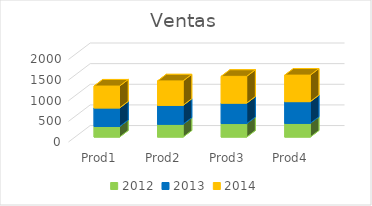
| Category | 2012 | 2013 | 2014 |
|---|---|---|---|
| Prod1 | 256 | 450 | 530 |
| Prod2 | 312 | 458 | 591 |
| Prod3 | 328 | 495 | 648 |
| Prod4 | 334 | 525 | 642 |